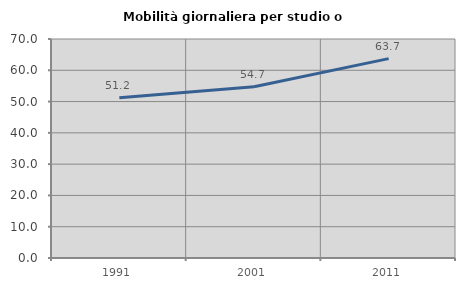
| Category | Mobilità giornaliera per studio o lavoro |
|---|---|
| 1991.0 | 51.227 |
| 2001.0 | 54.717 |
| 2011.0 | 63.735 |